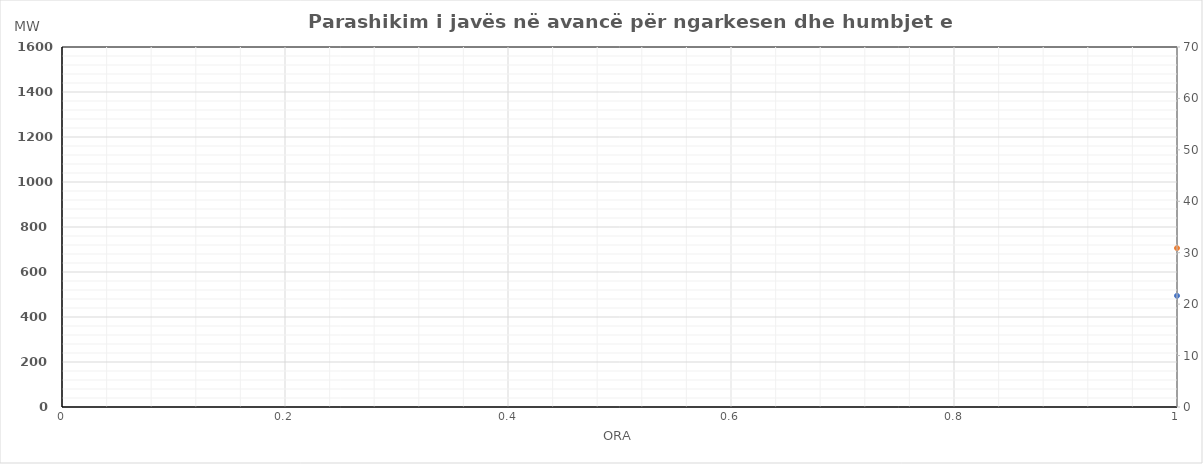
| Category | Ngarkesa (MWh) |
|---|---|
| 0 | 706.215 |
| 1 | 609.902 |
| 2 | 562.377 |
| 3 | 548.483 |
| 4 | 557.362 |
| 5 | 629.012 |
| 6 | 845.938 |
| 7 | 1145.364 |
| 8 | 1287.73 |
| 9 | 1337.881 |
| 10 | 1339.051 |
| 11 | 1341.156 |
| 12 | 1337.009 |
| 13 | 1373.922 |
| 14 | 1395.828 |
| 15 | 1408.347 |
| 16 | 1428.709 |
| 17 | 1466.366 |
| 18 | 1461.518 |
| 19 | 1426.363 |
| 20 | 1378.073 |
| 21 | 1248.762 |
| 22 | 1065.351 |
| 23 | 841.037 |
| 24 | 686.183 |
| 25 | 607.051 |
| 26 | 566.812 |
| 27 | 550.497 |
| 28 | 548.7 |
| 29 | 622.494 |
| 30 | 838.354 |
| 31 | 1111.803 |
| 32 | 1204.127 |
| 33 | 1184.048 |
| 34 | 1128.705 |
| 35 | 1075.33 |
| 36 | 1082.01 |
| 37 | 1091.183 |
| 38 | 1110.635 |
| 39 | 1136.151 |
| 40 | 1200.053 |
| 41 | 1334.302 |
| 42 | 1369.216 |
| 43 | 1357.699 |
| 44 | 1330.792 |
| 45 | 1220.828 |
| 46 | 1058.438 |
| 47 | 870.527 |
| 48 | 724.895 |
| 49 | 613.587 |
| 50 | 562.084 |
| 51 | 545.263 |
| 52 | 549.864 |
| 53 | 608.67 |
| 54 | 802.182 |
| 55 | 1068.086 |
| 56 | 1146.041 |
| 57 | 1116.762 |
| 58 | 1076.813 |
| 59 | 1057.573 |
| 60 | 1057.199 |
| 61 | 1088.103 |
| 62 | 1138.016 |
| 63 | 1158.854 |
| 64 | 1210.862 |
| 65 | 1298.385 |
| 66 | 1306.185 |
| 67 | 1295.766 |
| 68 | 1265.849 |
| 69 | 1167.612 |
| 70 | 992.386 |
| 71 | 797.049 |
| 72 | 647.649 |
| 73 | 569.584 |
| 74 | 535.453 |
| 75 | 521.654 |
| 76 | 528.339 |
| 77 | 595.465 |
| 78 | 766.327 |
| 79 | 1007.438 |
| 80 | 1096.221 |
| 81 | 1101.118 |
| 82 | 1045.034 |
| 83 | 1058.367 |
| 84 | 1071.476 |
| 85 | 1094.035 |
| 86 | 1098.56 |
| 87 | 1092.115 |
| 88 | 1112.748 |
| 89 | 1202.914 |
| 90 | 1226.686 |
| 91 | 1216 |
| 92 | 1180.474 |
| 93 | 1078.679 |
| 94 | 926.294 |
| 95 | 757.277 |
| 96 | 627.209 |
| 97 | 551.141 |
| 98 | 524.038 |
| 99 | 516.975 |
| 100 | 528.11 |
| 101 | 585.311 |
| 102 | 743.409 |
| 103 | 974.076 |
| 104 | 1052.46 |
| 105 | 1067.19 |
| 106 | 1031.757 |
| 107 | 1008.694 |
| 108 | 993.36 |
| 109 | 1021.232 |
| 110 | 1037.974 |
| 111 | 1022.176 |
| 112 | 1059.303 |
| 113 | 1160.922 |
| 114 | 1172.554 |
| 115 | 1157.776 |
| 116 | 1117.826 |
| 117 | 1019.59 |
| 118 | 883.267 |
| 119 | 734.886 |
| 120 | 626.566 |
| 121 | 563.791 |
| 122 | 535.378 |
| 123 | 519.823 |
| 124 | 521.068 |
| 125 | 559.675 |
| 126 | 680.862 |
| 127 | 861.097 |
| 128 | 1064.767 |
| 129 | 1173.783 |
| 130 | 1258.516 |
| 131 | 1306.285 |
| 132 | 1316.852 |
| 133 | 1318.93 |
| 134 | 1300.487 |
| 135 | 1264.519 |
| 136 | 1279.418 |
| 137 | 1343.178 |
| 138 | 1326.458 |
| 139 | 1304.853 |
| 140 | 1263.554 |
| 141 | 1138.888 |
| 142 | 1004.356 |
| 143 | 866.175 |
| 144 | 737.332 |
| 145 | 632.467 |
| 146 | 561.426 |
| 147 | 536.783 |
| 148 | 537.135 |
| 149 | 574.383 |
| 150 | 663.99 |
| 151 | 833.15 |
| 152 | 1004.826 |
| 153 | 1109.52 |
| 154 | 1112.354 |
| 155 | 1090.165 |
| 156 | 1092.204 |
| 157 | 1096.497 |
| 158 | 1095.187 |
| 159 | 1124.468 |
| 160 | 1218.17 |
| 161 | 1370.404 |
| 162 | 1413.388 |
| 163 | 1411.881 |
| 164 | 1376.549 |
| 165 | 1252.087 |
| 166 | 1044.084 |
| 167 | 841.542 |